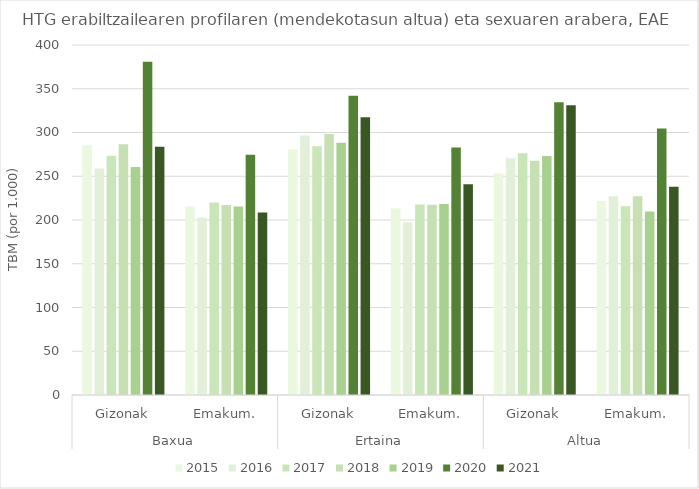
| Category | 2015 | 2016 | 2017 | 2018 | 2019 | 2020 | 2021 |
|---|---|---|---|---|---|---|---|
| 0 | 285.301 | 258.856 | 273.504 | 286.709 | 260.495 | 380.952 | 283.619 |
| 1 | 215.536 | 202.859 | 219.882 | 217.225 | 215.553 | 274.705 | 208.505 |
| 2 | 280.632 | 296.614 | 284.416 | 298.26 | 288.274 | 341.969 | 317.403 |
| 3 | 213.382 | 197.39 | 217.766 | 217.469 | 218.155 | 282.909 | 240.979 |
| 4 | 253.193 | 270.709 | 276.309 | 267.624 | 273.16 | 334.556 | 331.04 |
| 5 | 221.727 | 227.248 | 215.843 | 227.064 | 209.671 | 304.593 | 237.937 |